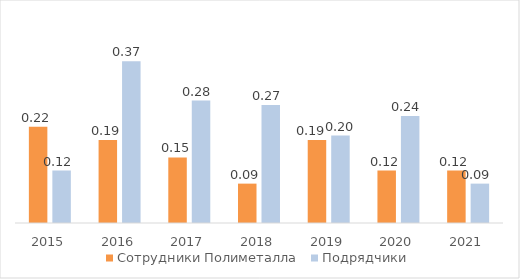
| Category | Сотрудники Полиметалла | Подрядчики |
|---|---|---|
| 2015.0 | 0.22 | 0.12 |
| 2016.0 | 0.19 | 0.37 |
| 2017.0 | 0.15 | 0.28 |
| 2018.0 | 0.09 | 0.27 |
| 2019.0 | 0.19 | 0.2 |
| 2020.0 | 0.12 | 0.245 |
| 2021.0 | 0.12 | 0.09 |